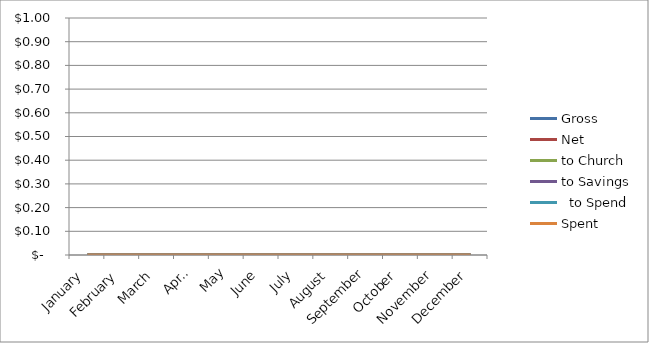
| Category | Gross | Net | to Church | to Savings |   to Spend | Spent |
|---|---|---|---|---|---|---|
| January | 0 | 0 | 0 | 0 | 0 | 0 |
| February | 0 | 0 | 0 | 0 | 0 | 0 |
| March | 0 | 0 | 0 | 0 | 0 | 0 |
| April | 0 | 0 | 0 | 0 | 0 | 0 |
| May | 0 | 0 | 0 | 0 | 0 | 0 |
| June | 0 | 0 | 0 | 0 | 0 | 0 |
| July | 0 | 0 | 0 | 0 | 0 | 0 |
| August | 0 | 0 | 0 | 0 | 0 | 0 |
| September | 0 | 0 | 0 | 0 | 0 | 0 |
| October | 0 | 0 | 0 | 0 | 0 | 0 |
| November | 0 | 0 | 0 | 0 | 0 | 0 |
| December | 0 | 0 | 0 | 0 | 0 | 0 |